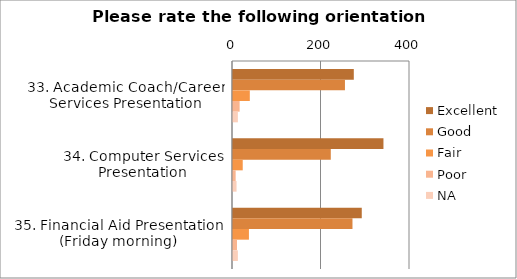
| Category | Excellent | Good | Fair | Poor | NA |
|---|---|---|---|---|---|
| 33. Academic Coach/Career Services Presentation | 273 | 253 | 38 | 15 | 11 |
| 34. Computer Services Presentation | 340 | 221 | 22 | 6 | 8 |
| 35. Financial Aid Presentation (Friday morning) | 291 | 270 | 36 | 9 | 11 |